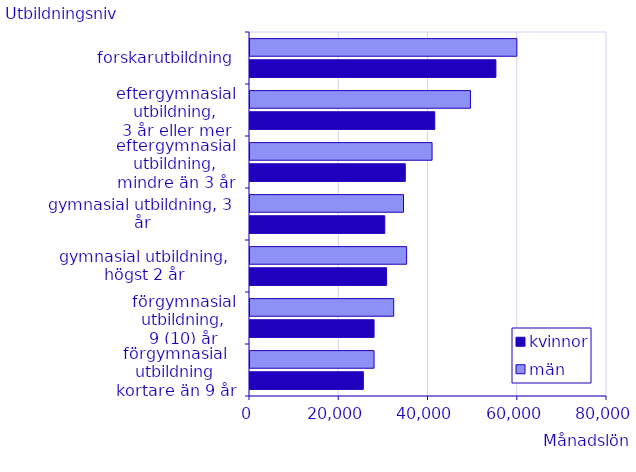
| Category | kvinnor | män |
|---|---|---|
| förgymnasial utbildning
kortare än 9 år | 25400 | 27800 |
| förgymnasial utbildning,
9 (10) år | 27800 | 32200 |
| gymnasial utbildning,
högst 2 år | 30600 | 35100 |
| gymnasial utbildning, 3 år | 30200 | 34400 |
| eftergymnasial utbildning,
mindre än 3 år | 34800 | 40800 |
| eftergymnasial utbildning,
3 år eller mer | 41400 | 49400 |
| forskarutbildning | 55100 | 59800 |